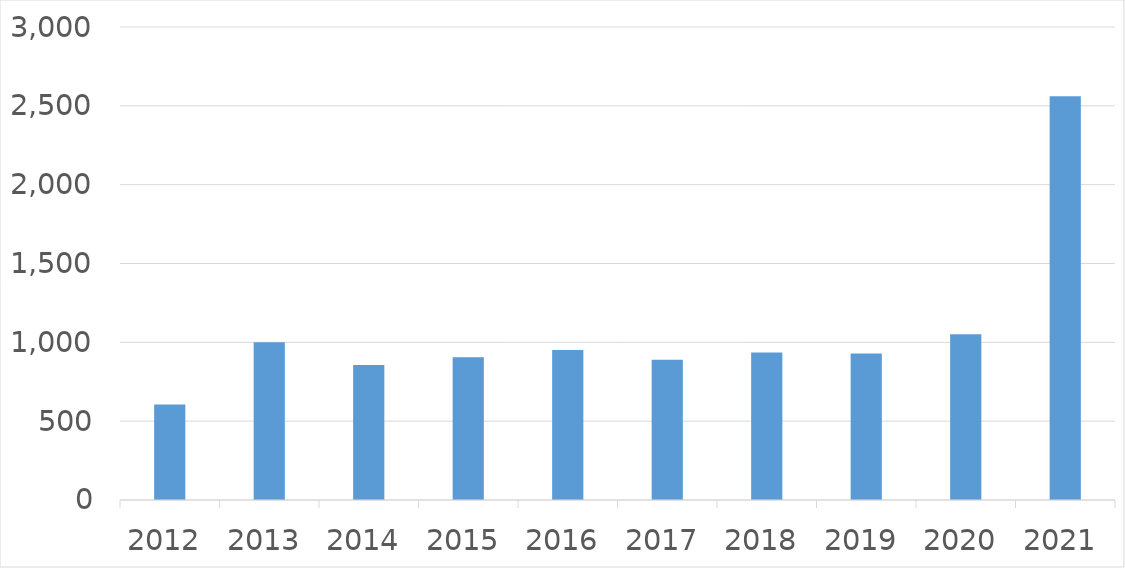
| Category | Series 0 |
|---|---|
| 2012 | 606 |
| 2013 | 1000 |
| 2014 | 856 |
| 2015 | 905 |
| 2016 | 951 |
| 2017 | 890 |
| 2018 | 936 |
| 2019 | 929 |
| 2020 | 1052 |
| 2021 | 2560 |